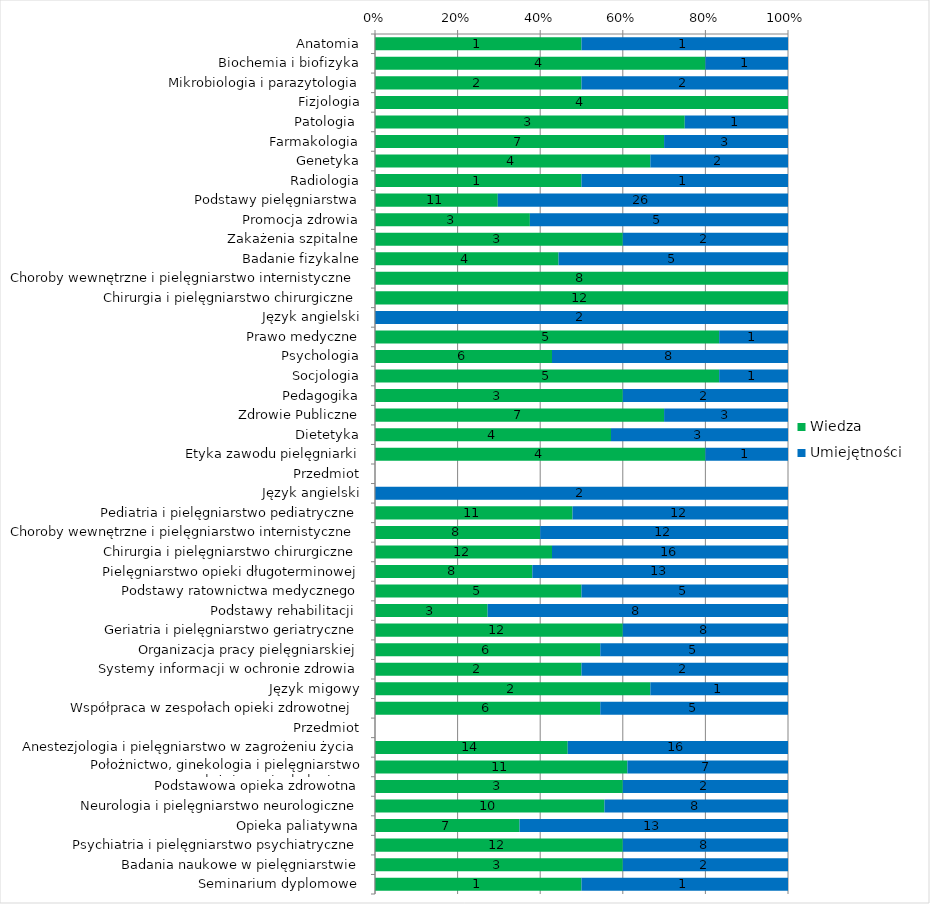
| Category | Wiedza | Umiejętności |
|---|---|---|
| Anatomia | 1 | 1 |
| Biochemia i biofizyka | 4 | 1 |
| Mikrobiologia i parazytologia | 2 | 2 |
| Fizjologia | 4 | 0 |
| Patologia  | 3 | 1 |
| Farmakologia | 7 | 3 |
| Genetyka | 4 | 2 |
| Radiologia | 1 | 1 |
| Podstawy pielęgniarstwa | 11 | 26 |
| Promocja zdrowia | 3 | 5 |
| Zakażenia szpitalne | 3 | 2 |
| Badanie fizykalne | 4 | 5 |
| Choroby wewnętrzne i pielęgniarstwo internistyczne | 8 | 0 |
| Chirurgia i pielęgniarstwo chirurgiczne | 12 | 0 |
| Język angielski | 0 | 2 |
| Prawo medyczne | 5 | 1 |
| Psychologia | 6 | 8 |
| Socjologia | 5 | 1 |
| Pedagogika | 3 | 2 |
| Zdrowie Publiczne | 7 | 3 |
| Dietetyka | 4 | 3 |
| Etyka zawodu pielęgniarki | 4 | 1 |
| Przedmiot | 0 | 0 |
| Język angielski | 0 | 2 |
| Pediatria i pielęgniarstwo pediatryczne | 11 | 12 |
| Choroby wewnętrzne i pielęgniarstwo internistyczne | 8 | 12 |
| Chirurgia i pielęgniarstwo chirurgiczne | 12 | 16 |
| Pielęgniarstwo opieki długoterminowej | 8 | 13 |
| Podstawy ratownictwa medycznego | 5 | 5 |
| Podstawy rehabilitacji  | 3 | 8 |
| Geriatria i pielęgniarstwo geriatryczne | 12 | 8 |
| Organizacja pracy pielęgniarskiej | 6 | 5 |
| Systemy informacji w ochronie zdrowia | 2 | 2 |
| Język migowy | 2 | 1 |
| Współpraca w zespołach opieki zdrowotnej  | 6 | 5 |
| Przedmiot | 0 | 0 |
| Anestezjologia i pielęgniarstwo w zagrożeniu życia | 14 | 16 |
| Położnictwo, ginekologia i pielęgniarstwo położniczo-ginekologiczne | 11 | 7 |
| Podstawowa opieka zdrowotna | 3 | 2 |
| Neurologia i pielęgniarstwo neurologiczne | 10 | 8 |
| Opieka paliatywna | 7 | 13 |
| Psychiatria i pielęgniarstwo psychiatryczne | 12 | 8 |
| Badania naukowe w pielęgniarstwie | 3 | 2 |
| Seminarium dyplomowe | 1 | 1 |